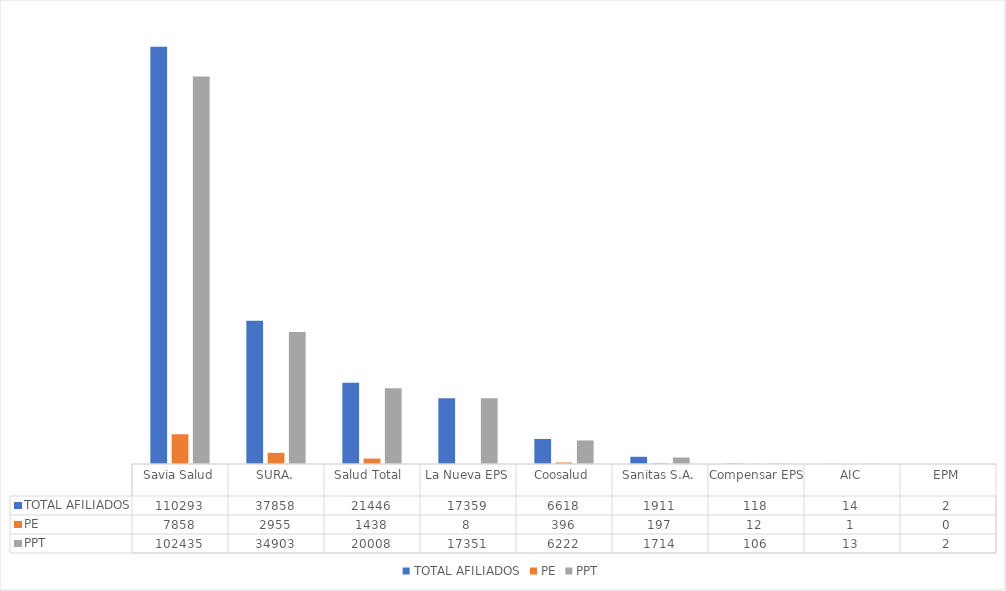
| Category | TOTAL AFILIADOS | PE | PPT |
|---|---|---|---|
| Savia Salud | 110293 | 7858 | 102435 |
| SURA. | 37858 | 2955 | 34903 |
| Salud Total  | 21446 | 1438 | 20008 |
| La Nueva EPS | 17359 | 8 | 17351 |
| Coosalud | 6618 | 396 | 6222 |
| Sanitas S.A. | 1911 | 197 | 1714 |
| Compensar EPS | 118 | 12 | 106 |
| AIC | 14 | 1 | 13 |
| EPM | 2 | 0 | 2 |